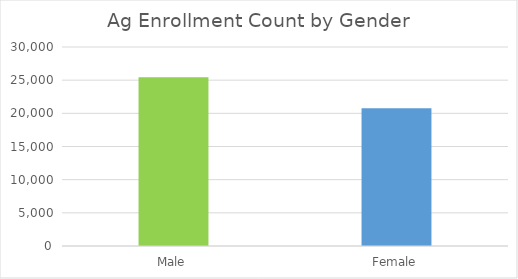
| Category | Count |
|---|---|
| Male | 25429 |
| Female | 20756 |